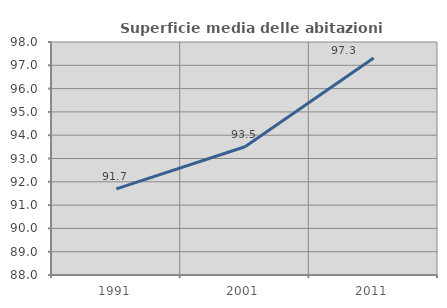
| Category | Superficie media delle abitazioni occupate |
|---|---|
| 1991.0 | 91.696 |
| 2001.0 | 93.506 |
| 2011.0 | 97.31 |